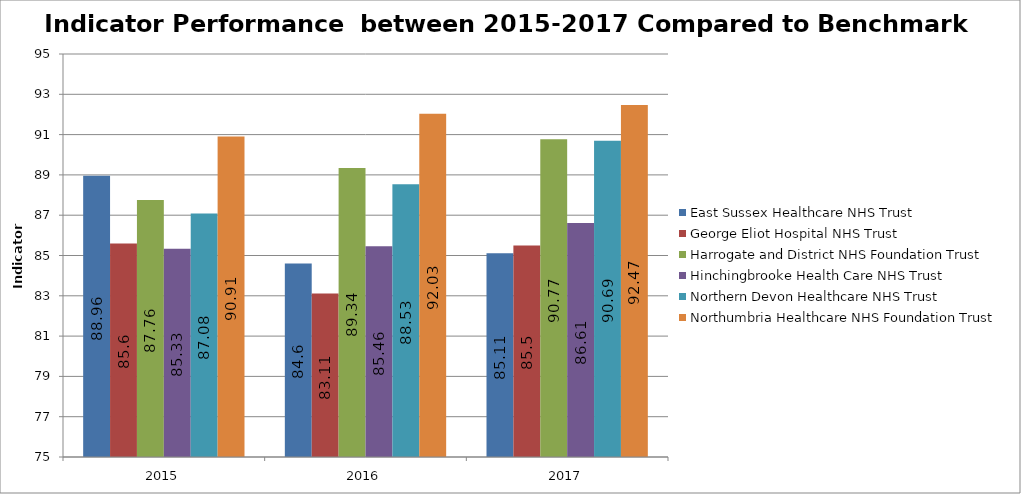
| Category | East Sussex Healthcare NHS Trust | George Eliot Hospital NHS Trust | Harrogate and District NHS Foundation Trust | Hinchingbrooke Health Care NHS Trust | Northern Devon Healthcare NHS Trust | Northumbria Healthcare NHS Foundation Trust |
|---|---|---|---|---|---|---|
| 2015 | 88.96 | 85.6 | 87.76 | 85.33 | 87.08 | 90.91 |
| 2016 | 84.6 | 83.11 | 89.34 | 85.46 | 88.53 | 92.03 |
| 2017 | 85.11 | 85.5 | 90.77 | 86.61 | 90.69 | 92.47 |